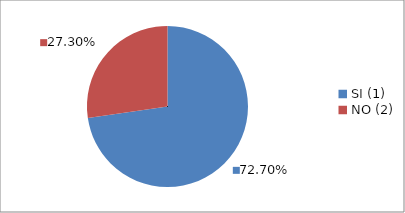
| Category | Series 0 |
|---|---|
| SI (1) | 0.727 |
| NO (2) | 0.273 |